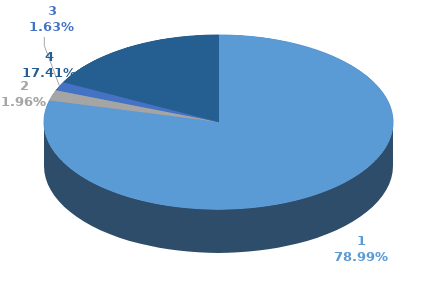
| Category | Series 0 | Series 1 |
|---|---|---|
| 0 | 1307120 |  |
| 1 | 32397 |  |
| 2 | 27055 |  |
| 3 | 288170 |  |